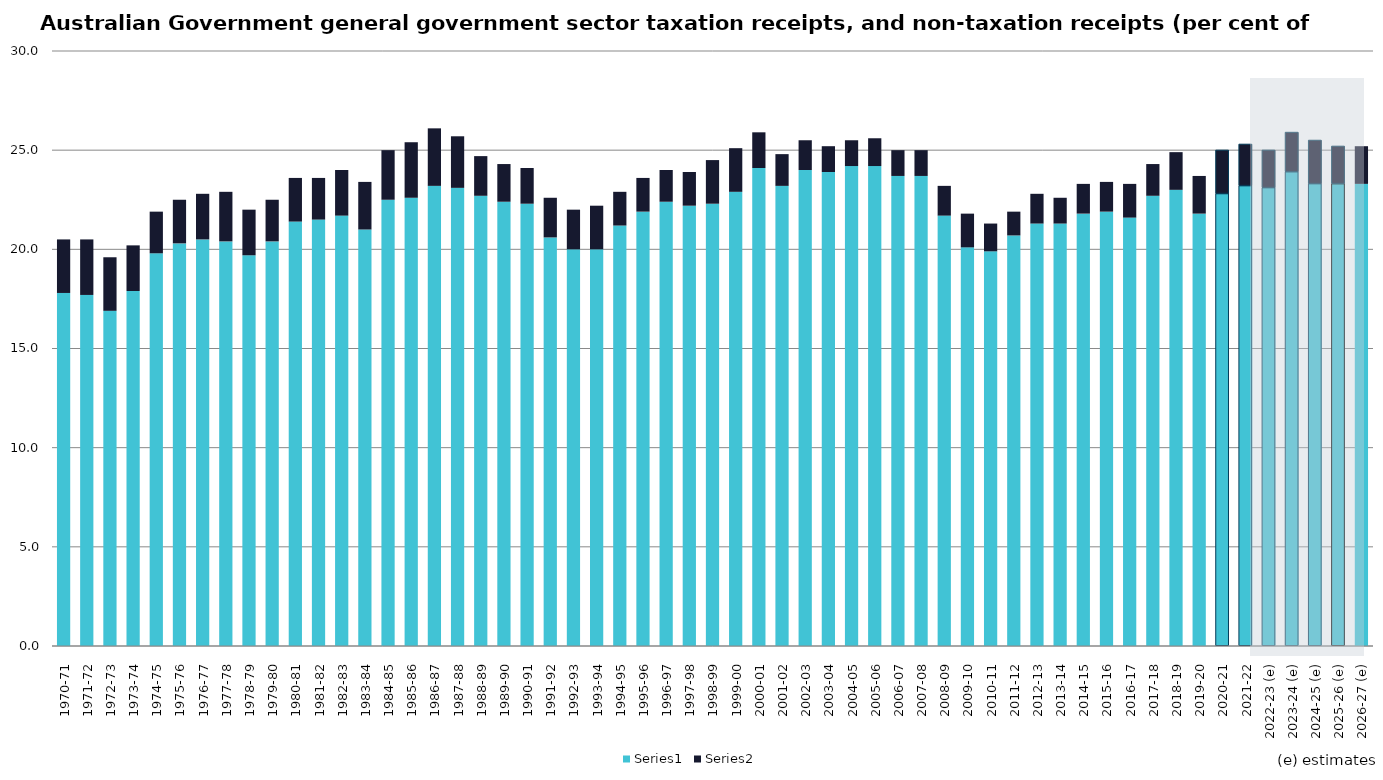
| Category | Series 0 | Series 1 |
|---|---|---|
| 1970-71 | 17.8 | 2.7 |
| 1971-72 | 17.7 | 2.8 |
| 1972-73 | 16.9 | 2.7 |
| 1973-74 | 17.9 | 2.3 |
| 1974-75 | 19.8 | 2.1 |
| 1975-76 | 20.3 | 2.2 |
| 1976-77 | 20.5 | 2.3 |
| 1977-78 | 20.4 | 2.5 |
| 1978-79 | 19.7 | 2.3 |
| 1979-80 | 20.4 | 2.1 |
| 1980-81 | 21.4 | 2.2 |
| 1981-82 | 21.5 | 2.1 |
| 1982-83 | 21.7 | 2.3 |
| 1983-84 | 21 | 2.4 |
| 1984-85 | 22.5 | 2.5 |
| 1985-86 | 22.6 | 2.8 |
| 1986-87 | 23.2 | 2.9 |
| 1987-88 | 23.1 | 2.6 |
| 1988-89 | 22.7 | 2 |
| 1989-90 | 22.4 | 1.9 |
| 1990-91 | 22.3 | 1.8 |
| 1991-92 | 20.6 | 2 |
| 1992-93 | 20 | 2 |
| 1993-94 | 20 | 2.2 |
| 1994-95 | 21.2 | 1.7 |
| 1995-96 | 21.9 | 1.7 |
| 1996-97 | 22.4 | 1.6 |
| 1997-98 | 22.2 | 1.7 |
| 1998-99 | 22.3 | 2.2 |
| 1999-00 | 22.9 | 2.2 |
| 2000-01 | 24.1 | 1.8 |
| 2001-02 | 23.2 | 1.6 |
| 2002-03 | 24 | 1.5 |
| 2003-04 | 23.9 | 1.3 |
| 2004-05 | 24.2 | 1.3 |
| 2005-06 | 24.2 | 1.4 |
| 2006-07 | 23.7 | 1.3 |
| 2007-08 | 23.7 | 1.3 |
| 2008-09 | 21.7 | 1.5 |
| 2009-10 | 20.1 | 1.7 |
| 2010-11 | 19.9 | 1.4 |
| 2011-12 | 20.7 | 1.2 |
| 2012-13 | 21.3 | 1.5 |
| 2013-14 | 21.3 | 1.3 |
| 2014-15 | 21.8 | 1.5 |
| 2015-16 | 21.9 | 1.5 |
| 2016-17 | 21.6 | 1.7 |
| 2017-18 | 22.7 | 1.6 |
| 2018-19 | 23 | 1.9 |
| 2019-20 | 21.8 | 1.9 |
| 2020-21 | 22.8 | 2.2 |
| 2021-22 | 23.2 | 2.1 |
| 2022-23 (e) | 23.1 | 1.9 |
| 2023-24 (e) | 23.9 | 2 |
| 2024-25 (e) | 23.3 | 2.2 |
| 2025-26 (e) | 23.3 | 1.9 |
| 2026-27 (e) | 23.3 | 1.9 |